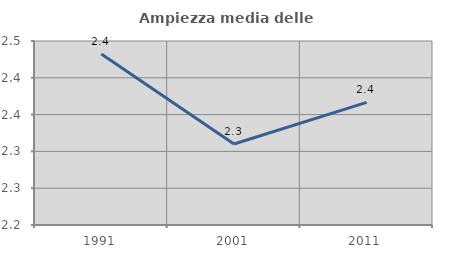
| Category | Ampiezza media delle famiglie |
|---|---|
| 1991.0 | 2.432 |
| 2001.0 | 2.31 |
| 2011.0 | 2.367 |